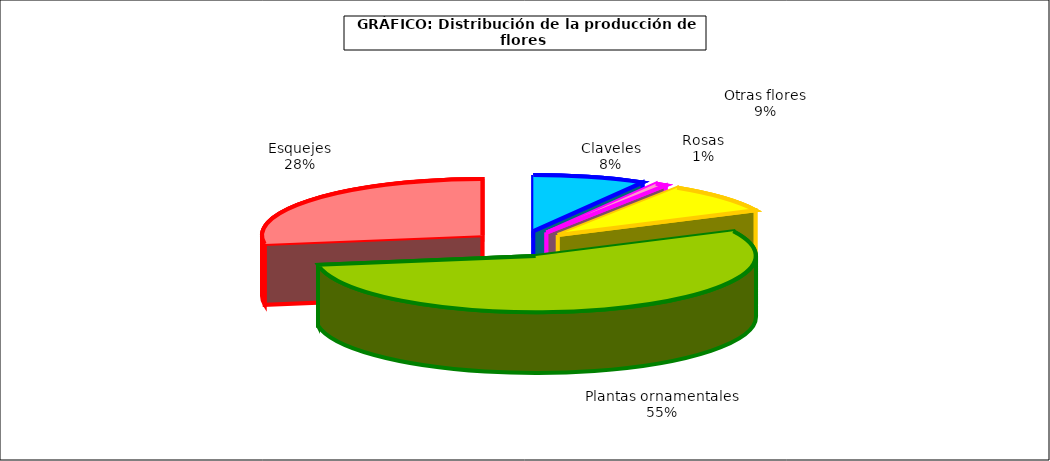
| Category | Series 0 |
|---|---|
| 0 | 45726 |
| 1 | 4688 |
| 2 | 47678 |
| 3 | 303566 |
| 4 | 152377 |